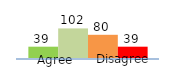
| Category | Series 0 | Series 1 | Series 2 | Series 3 |
|---|---|---|---|---|
| 0 | 39 | 102 | 80 | 39 |